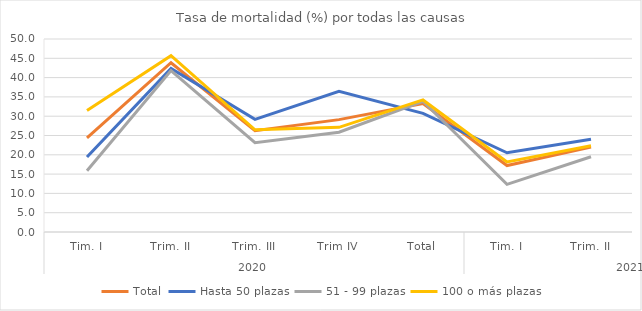
| Category | Total | Hasta 50 plazas | 51 - 99 plazas | 100 o más plazas |
|---|---|---|---|---|
| 0 | 24.387 | 19.431 | 15.848 | 31.46 |
| 1 | 43.85 | 42.391 | 41.801 | 45.692 |
| 2 | 26.257 | 29.172 | 23.128 | 26.464 |
| 3 | 29.109 | 36.436 | 25.842 | 27.114 |
| 4 | 33.252 | 30.722 | 33.876 | 34.211 |
| 5 | 17.215 | 20.517 | 12.333 | 18.166 |
| 6 | 21.996 | 24.003 | 19.492 | 22.354 |